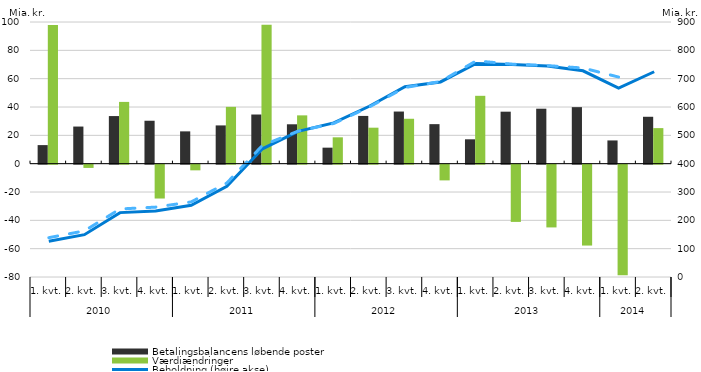
| Category | Betalingsbalancens løbende poster | Værdiændringer |
|---|---|---|
| 0 | 13.1 | 97.9 |
| 1 | 26.2 | -2.3 |
| 2 | 33.6 | 43.6 |
| 3 | 30.3 | -23.9 |
| 4 | 22.8 | -4 |
| 5 | 27 | 40.1 |
| 6 | 34.7 | 98 |
| 7 | 27.8 | 34.1 |
| 8 | 11.3 | 18.6 |
| 9 | 33.7 | 25.4 |
| 10 | 36.8 | 31.7 |
| 11 | 27.9 | -11.1 |
| 12 | 17.2 | 47.9 |
| 13 | 36.7 | -40.4 |
| 14 | 38.8 | -44.3 |
| 15 | 39.9 | -57.1 |
| 16 | 16.4 | -78 |
| 17 | 33.1 | 25.1 |